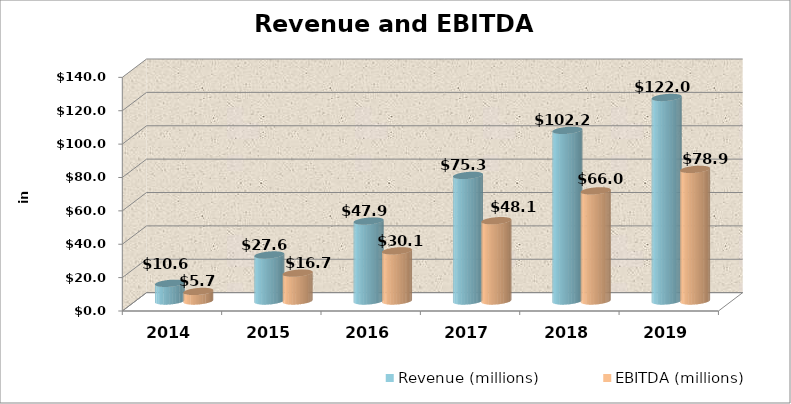
| Category | Revenue (millions) | EBITDA (millions) |
|---|---|---|
| 2014.0 | 10.604 | 5.727 |
| 2015.0 | 27.571 | 16.702 |
| 2016.0 | 47.9 | 30.054 |
| 2017.0 | 75.256 | 48.123 |
| 2018.0 | 102.248 | 66.005 |
| 2019.0 | 121.959 | 78.865 |